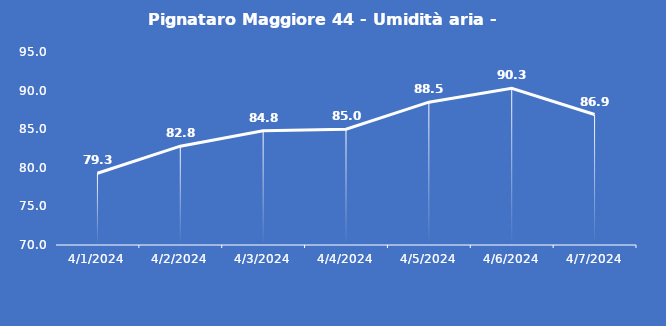
| Category | Pignataro Maggiore 44 - Umidità aria - Grezzo (%) |
|---|---|
| 4/1/24 | 79.3 |
| 4/2/24 | 82.8 |
| 4/3/24 | 84.8 |
| 4/4/24 | 85 |
| 4/5/24 | 88.5 |
| 4/6/24 | 90.3 |
| 4/7/24 | 86.9 |